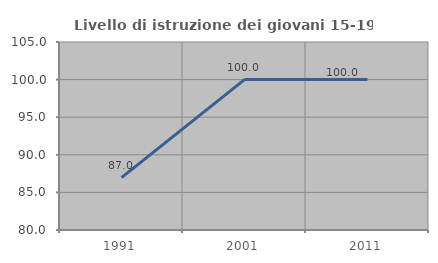
| Category | Livello di istruzione dei giovani 15-19 anni |
|---|---|
| 1991.0 | 86.957 |
| 2001.0 | 100 |
| 2011.0 | 100 |